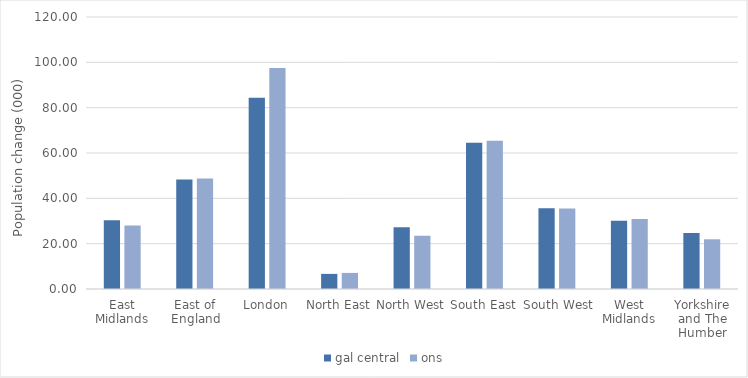
| Category | gal central | ons |
|---|---|---|
| East Midlands | 30.384 | 28.053 |
| East of England | 48.313 | 48.768 |
| London | 84.348 | 97.474 |
| North East | 6.668 | 7.086 |
| North West | 27.231 | 23.467 |
| South East | 64.507 | 65.384 |
| South West | 35.67 | 35.528 |
| West Midlands | 30.155 | 30.912 |
| Yorkshire and The Humber | 24.659 | 21.923 |